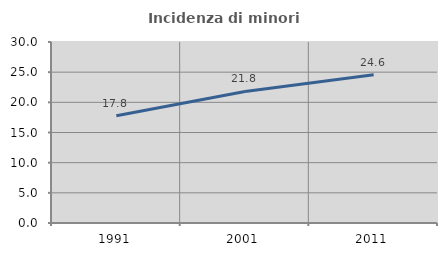
| Category | Incidenza di minori stranieri |
|---|---|
| 1991.0 | 17.763 |
| 2001.0 | 21.8 |
| 2011.0 | 24.554 |